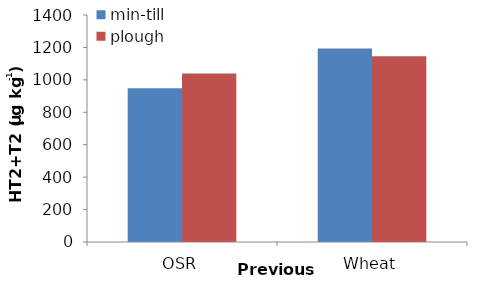
| Category | min-till | plough |
|---|---|---|
| OSR | 948.418 | 1039.92 |
| Wheat | 1193.988 | 1145.513 |